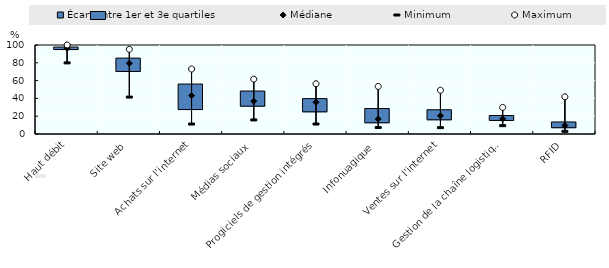
| Category | 1er quartile | Écart entre 1er et 3e quartiles |
|---|---|---|
| Haut débit | 94.337 | 3.362 |
| Site web | 69.697 | 15.578 |
| Achats sur l'internet | 26.915 | 29.2 |
| Médias sociaux | 30.674 | 17.615 |
| Progiciels de gestion intégrés | 24.366 | 15.404 |
| Infonuagique | 12.05 | 16.575 |
| Ventes sur l'internet | 15.397 | 11.847 |
| Gestion de la chaîne logistique (EAD) | 14.65 | 6.118 |
| RFID | 6.5 | 7.025 |